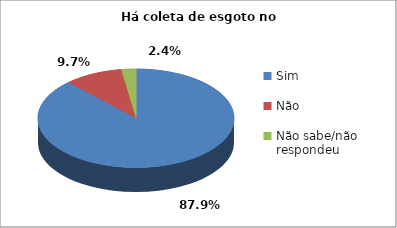
| Category | Series 0 |
|---|---|
| Sim | 109 |
| Não | 12 |
| Não sabe/não respondeu | 3 |